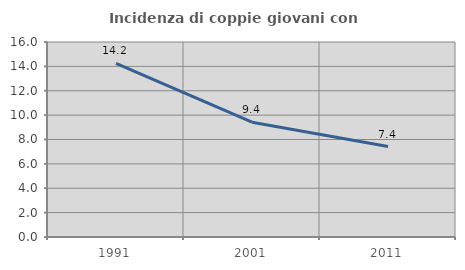
| Category | Incidenza di coppie giovani con figli |
|---|---|
| 1991.0 | 14.245 |
| 2001.0 | 9.418 |
| 2011.0 | 7.425 |